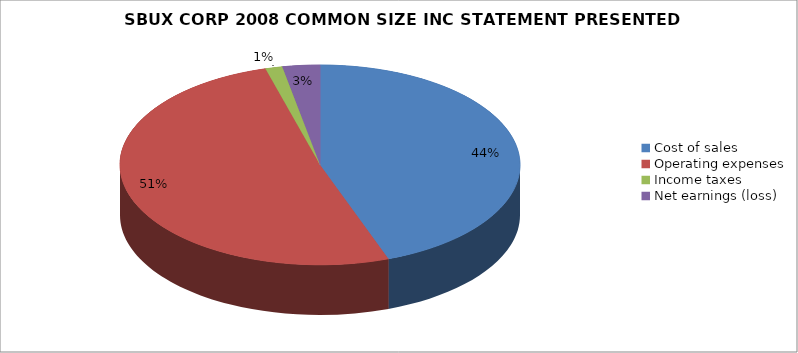
| Category | Cost of sales  Operating expenses Income taxes Net earnings (loss) |
|---|---|
| Cost of sales  | 4645300 |
| Operating expenses | 5347400 |
| Income taxes | 144000 |
| Net earnings (loss) | 315500 |